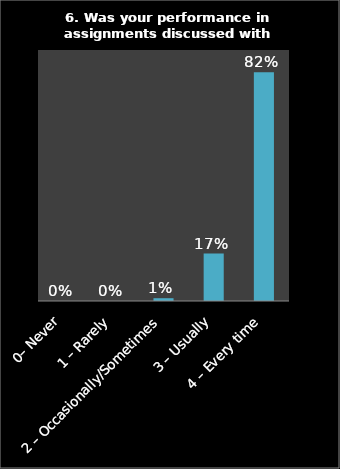
| Category | Series 0 |
|---|---|
| 0– Never | 0 |
| 1 – Rarely | 0 |
| 2 – Occasionally/Sometimes | 0.01 |
| 3 – Usually | 0.17 |
| 4 – Every time | 0.82 |